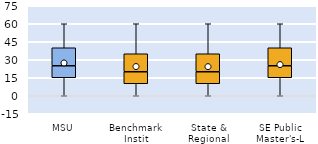
| Category | 25th | 50th | 75th |
|---|---|---|---|
| MSU | 15 | 10 | 15 |
| Benchmark Instit | 10 | 10 | 15 |
| State & Regional | 10 | 10 | 15 |
| SE Public Master's-L | 15 | 10 | 15 |